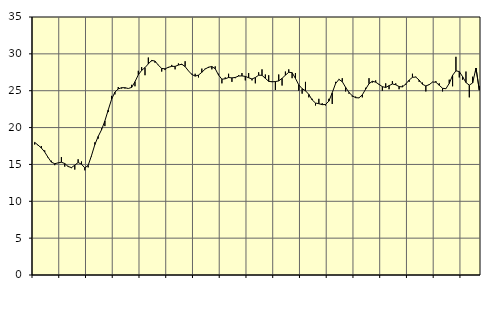
| Category | Piggar | Series 1 |
|---|---|---|
| nan | 17.7 | 17.99 |
| 87.0 | 17.6 | 17.63 |
| 87.0 | 17.5 | 17.23 |
| 87.0 | 16.9 | 16.69 |
| nan | 15.9 | 15.96 |
| 88.0 | 15.5 | 15.31 |
| 88.0 | 14.9 | 15.1 |
| 88.0 | 15.2 | 15.21 |
| nan | 16 | 15.3 |
| 89.0 | 14.7 | 15.12 |
| 89.0 | 14.8 | 14.72 |
| 89.0 | 14.5 | 14.57 |
| nan | 14.3 | 14.9 |
| 90.0 | 15.7 | 15.26 |
| 90.0 | 15.4 | 15.03 |
| 90.0 | 14.2 | 14.53 |
| nan | 14.6 | 14.87 |
| 91.0 | 16.1 | 16.2 |
| 91.0 | 18 | 17.69 |
| 91.0 | 18.5 | 18.8 |
| nan | 19.9 | 19.7 |
| 92.0 | 20.2 | 20.9 |
| 92.0 | 22.1 | 22.39 |
| 92.0 | 24.3 | 23.83 |
| nan | 24.5 | 24.81 |
| 93.0 | 25.5 | 25.24 |
| 93.0 | 25.3 | 25.41 |
| 93.0 | 25.3 | 25.41 |
| nan | 25.3 | 25.3 |
| 94.0 | 25.8 | 25.45 |
| 94.0 | 25.6 | 26.22 |
| 94.0 | 27.7 | 27.16 |
| nan | 28.2 | 27.76 |
| 95.0 | 27.1 | 28.14 |
| 95.0 | 29.5 | 28.64 |
| 95.0 | 29 | 29.11 |
| nan | 28.8 | 29.02 |
| 96.0 | 28.5 | 28.46 |
| 96.0 | 27.6 | 28.02 |
| 96.0 | 27.8 | 27.97 |
| nan | 28.1 | 28.18 |
| 97.0 | 28.5 | 28.3 |
| 97.0 | 27.9 | 28.3 |
| 97.0 | 28.7 | 28.48 |
| nan | 28.5 | 28.6 |
| 98.0 | 29 | 28.27 |
| 98.0 | 27.7 | 27.69 |
| 98.0 | 27.3 | 27.21 |
| nan | 27.3 | 26.98 |
| 99.0 | 26.8 | 27.12 |
| 99.0 | 28 | 27.5 |
| 99.0 | 28 | 27.94 |
| nan | 28.1 | 28.19 |
| 0.0 | 27.9 | 28.28 |
| 0.0 | 28.3 | 27.98 |
| 0.0 | 27.3 | 27.12 |
| nan | 26 | 26.56 |
| 1.0 | 26.8 | 26.62 |
| 1.0 | 27.3 | 26.79 |
| 1.0 | 26.2 | 26.74 |
| nan | 26.7 | 26.8 |
| 2.0 | 27.1 | 26.99 |
| 2.0 | 27.4 | 27.01 |
| 2.0 | 26.4 | 26.94 |
| nan | 27.4 | 26.76 |
| 3.0 | 26.4 | 26.59 |
| 3.0 | 26 | 26.79 |
| 3.0 | 27.5 | 27.1 |
| nan | 27.9 | 27.09 |
| 4.0 | 27.2 | 26.68 |
| 4.0 | 27.1 | 26.27 |
| 4.0 | 26.3 | 26.21 |
| nan | 25.1 | 26.24 |
| 5.0 | 27.2 | 26.33 |
| 5.0 | 25.7 | 26.68 |
| 5.0 | 27.6 | 27.11 |
| nan | 27.9 | 27.5 |
| 6.0 | 26.7 | 27.45 |
| 6.0 | 27.4 | 26.67 |
| 6.0 | 25 | 25.79 |
| nan | 24.6 | 25.28 |
| 7.0 | 26.2 | 24.99 |
| 7.0 | 24.1 | 24.5 |
| 7.0 | 23.9 | 23.75 |
| nan | 23 | 23.33 |
| 8.0 | 23.9 | 23.24 |
| 8.0 | 23.3 | 23.11 |
| 8.0 | 23 | 23.13 |
| nan | 23.9 | 23.59 |
| 9.0 | 23.2 | 24.72 |
| 9.0 | 26.2 | 25.97 |
| 9.0 | 26.6 | 26.53 |
| nan | 26.7 | 26.23 |
| 10.0 | 24.9 | 25.46 |
| 10.0 | 24.6 | 24.77 |
| 10.0 | 24.2 | 24.32 |
| nan | 24.2 | 24.05 |
| 11.0 | 24 | 24.03 |
| 11.0 | 24.1 | 24.44 |
| 11.0 | 25.4 | 25.22 |
| nan | 26.7 | 25.95 |
| 12.0 | 26.1 | 26.28 |
| 12.0 | 26.4 | 26.16 |
| 12.0 | 25.8 | 25.86 |
| nan | 25 | 25.55 |
| 13.0 | 26 | 25.44 |
| 13.0 | 25.2 | 25.69 |
| 13.0 | 26.3 | 25.91 |
| nan | 26 | 25.81 |
| 14.0 | 25.2 | 25.56 |
| 14.0 | 25.7 | 25.52 |
| 14.0 | 25.8 | 25.91 |
| nan | 26.2 | 26.44 |
| 15.0 | 27.3 | 26.82 |
| 15.0 | 26.9 | 26.85 |
| 15.0 | 26.2 | 26.44 |
| nan | 26.1 | 25.87 |
| 16.0 | 24.9 | 25.65 |
| 16.0 | 25.9 | 25.82 |
| 16.0 | 26.2 | 26.17 |
| nan | 26.3 | 26.16 |
| 17.0 | 26 | 25.74 |
| 17.0 | 24.9 | 25.33 |
| 17.0 | 25.3 | 25.27 |
| nan | 26.5 | 25.99 |
| 18.0 | 25.6 | 27.09 |
| 18.0 | 29.6 | 27.7 |
| 18.0 | 26.8 | 27.6 |
| nan | 26.5 | 26.9 |
| 19.0 | 27.6 | 26.11 |
| 19.0 | 24.1 | 25.76 |
| 19.0 | 26.9 | 26.05 |
| nan | 27.5 | 28.08 |
| 20.0 | 25.6 | 25.07 |